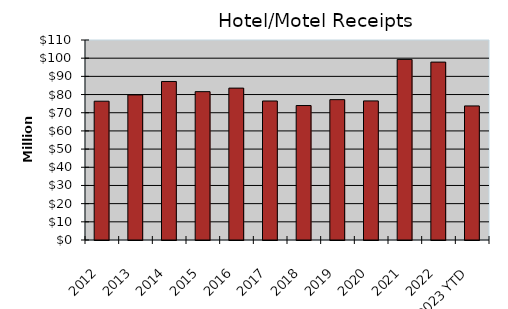
| Category | Series 0 |
|---|---|
| 2012 | 76336383 |
| 2013 | 79800711 |
| 2014 | 87185566 |
| 2015 | 81591184 |
| 2016 | 83535139 |
| 2017 | 76451012 |
| 2018 | 73956500 |
| 2019 | 77195748 |
| 2020 | 76496166 |
| 2021 | 99331312 |
| 2022 | 97843808 |
| 2023 YTD | 73734988 |